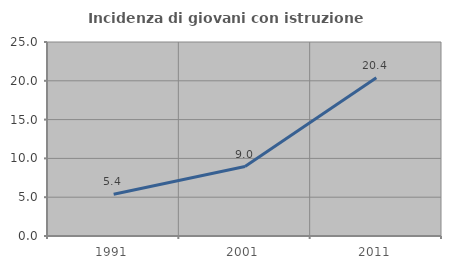
| Category | Incidenza di giovani con istruzione universitaria |
|---|---|
| 1991.0 | 5.374 |
| 2001.0 | 8.955 |
| 2011.0 | 20.393 |